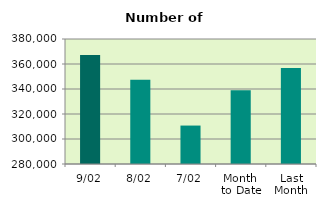
| Category | Series 0 |
|---|---|
| 9/02 | 367194 |
| 8/02 | 347392 |
| 7/02 | 310754 |
| Month 
to Date | 339076.857 |
| Last
Month | 356827.619 |